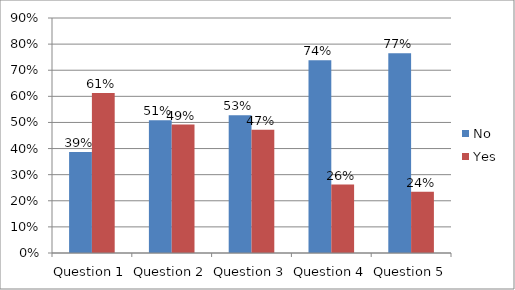
| Category | No | Yes |
|---|---|---|
| Question 1 | 0.387 | 0.613 |
| Question 2 | 0.508 | 0.492 |
| Question 3 | 0.528 | 0.472 |
| Question 4 | 0.738 | 0.262 |
| Question 5 | 0.765 | 0.235 |